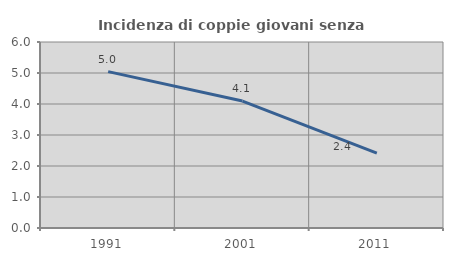
| Category | Incidenza di coppie giovani senza figli |
|---|---|
| 1991.0 | 5.045 |
| 2001.0 | 4.096 |
| 2011.0 | 2.413 |